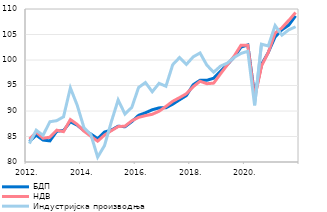
| Category | БДП | НДВ | Индустријска производња |
|---|---|---|---|
| 2012. | 84.024 | 84.494 | 83.609 |
| II | 85.251 | 85.857 | 86.234 |
| III | 84.299 | 84.659 | 85.224 |
| IV | 84.139 | 84.858 | 87.896 |
| 2013. | 86.026 | 86.24 | 88.106 |
| II | 86.173 | 85.95 | 88.862 |
| III | 87.889 | 88.328 | 94.533 |
| IV | 87.227 | 87.378 | 91.137 |
| 2014. | 86.15 | 86.04 | 86.698 |
| II | 85.49 | 85.033 | 85.394 |
| III | 84.574 | 84.08 | 80.962 |
| IV | 85.877 | 85.282 | 83.206 |
| 2015. | 86.251 | 86.137 | 87.873 |
| II | 87.022 | 86.937 | 92.164 |
| III | 86.911 | 87.029 | 89.406 |
| IV | 87.906 | 88.071 | 90.711 |
| 2016. | 89.156 | 88.746 | 94.617 |
| II | 89.647 | 89.092 | 95.578 |
| III | 90.243 | 89.356 | 93.774 |
| IV | 90.611 | 89.952 | 95.428 |
| 2017. | 90.63 | 90.897 | 94.854 |
| II | 91.344 | 91.908 | 99.082 |
| III | 92.197 | 92.623 | 100.494 |
| IV | 93.033 | 93.385 | 99.132 |
| 2018. | 95.145 | 94.758 | 100.62 |
| II | 96.029 | 95.834 | 101.379 |
| III | 96.021 | 95.353 | 98.984 |
| IV | 96.431 | 95.466 | 97.611 |
| 2019. | 97.789 | 97.287 | 98.802 |
| II | 99.113 | 99.042 | 99.392 |
| III | 100.562 | 100.773 | 100.509 |
| IV | 102.537 | 102.897 | 101.296 |
| 2020. | 102.944 | 102.894 | 101.707 |
| II | 93.083 | 92.606 | 91.109 |
| III | 99.099 | 98.825 | 103.1 |
| IV | 101.494 | 101.494 | 102.746 |
| 2021. | 104.528 | 105.299 | 106.758 |
| II | 105.94 | 106.305 | 104.887 |
| III | 106.844 | 107.769 | 105.898 |
| IV | 108.646 | 109.313 | 106.518 |